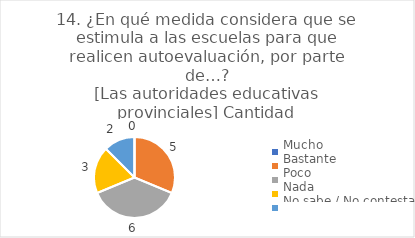
| Category | 14. ¿En qué medida considera que se estimula a las escuelas para que realicen autoevaluación, por parte de…?
[Las autoridades educativas provinciales] |
|---|---|
| Mucho  | 0 |
| Bastante  | 0.312 |
| Poco  | 0.375 |
| Nada  | 0.188 |
| No sabe / No contesta | 0.125 |